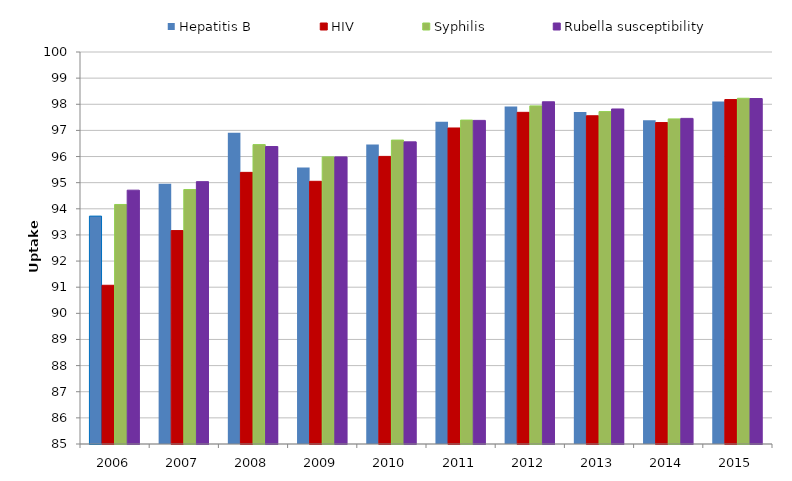
| Category | Hepatitis B | HIV | Syphilis | Rubella susceptibility |
|---|---|---|---|---|
| 2006.0 | 93.72 | 91.074 | 94.166 | 94.713 |
| 2007.0 | 94.958 | 93.166 | 94.737 | 95.039 |
| 2008.0 | 96.909 | 95.394 | 96.456 | 96.383 |
| 2009.0 | 95.577 | 95.052 | 95.986 | 95.986 |
| 2010.0 | 96.464 | 96.005 | 96.629 | 96.561 |
| 2011.0 | 97.335 | 97.093 | 97.395 | 97.384 |
| 2012.0 | 97.916 | 97.691 | 97.938 | 98.095 |
| 2013.0 | 97.7 | 97.56 | 97.72 | 97.82 |
| 2014.0 | 97.39 | 97.3 | 97.44 | 97.46 |
| 2015.0 | 98.11 | 98.18 | 98.23 | 98.22 |